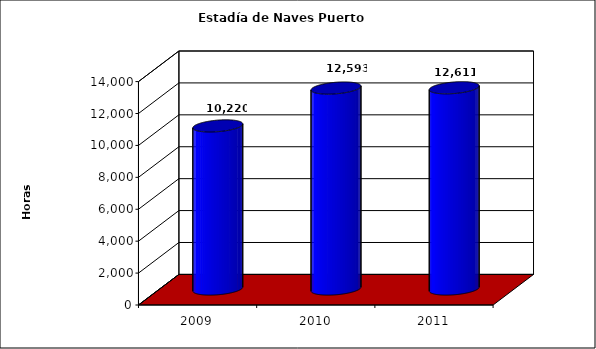
| Category | Series 0 |
|---|---|
| 2009.0 | 10219.833 |
| 2010.0 | 12593 |
| 2011.0 | 12611 |